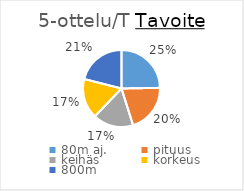
| Category | Series 0 |
|---|---|
| 80m aj. | 470 |
| pituus | 388 |
| keihäs | 323 |
| korkeus | 320 |
| 800m | 400 |